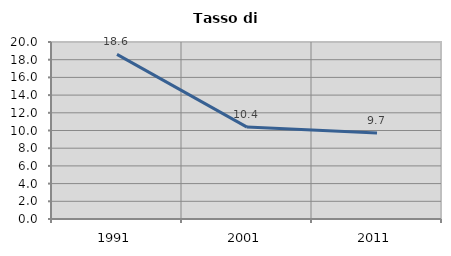
| Category | Tasso di disoccupazione   |
|---|---|
| 1991.0 | 18.601 |
| 2001.0 | 10.387 |
| 2011.0 | 9.707 |